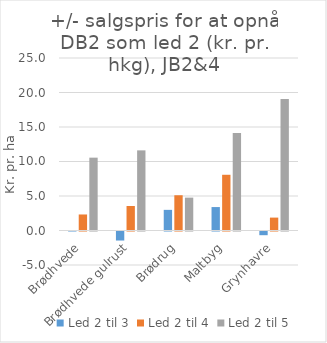
| Category | Led 2 til 3 | Led 2 til 4 | Led 2 til 5 |
|---|---|---|---|
| Brødhvede | 0.045 | 2.322 | 10.557 |
| Brødhvede gulrust | -1.309 | 3.549 | 11.613 |
| Brødrug | 2.991 | 5.109 | 4.764 |
| Maltbyg | 3.397 | 8.076 | 14.12 |
| Grynhavre | -0.536 | 1.869 | 19.067 |